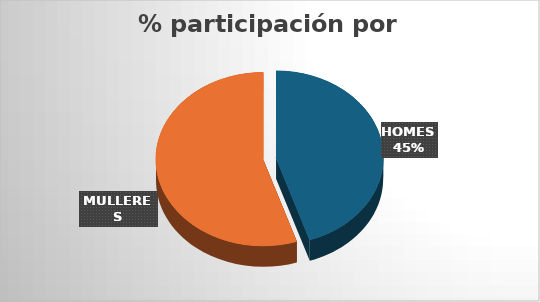
| Category | Series 0 |
|---|---|
| HOMES | 203 |
| MULLERES | 249 |